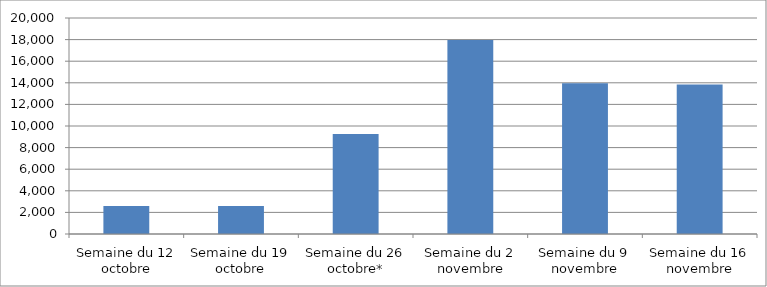
| Category | Series 0 |
|---|---|
| Semaine du 12 octobre | 2602.143 |
| Semaine du 19 octobre | 2587 |
| Semaine du 26 octobre* | 9262 |
| Semaine du 2 novembre | 17965 |
| Semaine du 9 novembre | 13968 |
| Semaine du 16 novembre | 13851 |